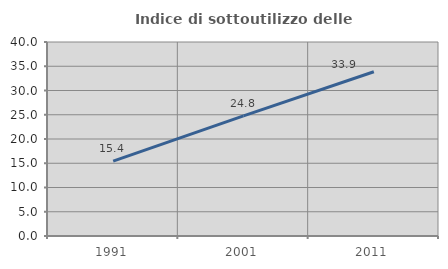
| Category | Indice di sottoutilizzo delle abitazioni  |
|---|---|
| 1991.0 | 15.424 |
| 2001.0 | 24.769 |
| 2011.0 | 33.86 |